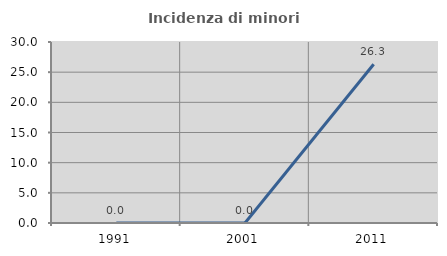
| Category | Incidenza di minori stranieri |
|---|---|
| 1991.0 | 0 |
| 2001.0 | 0 |
| 2011.0 | 26.316 |